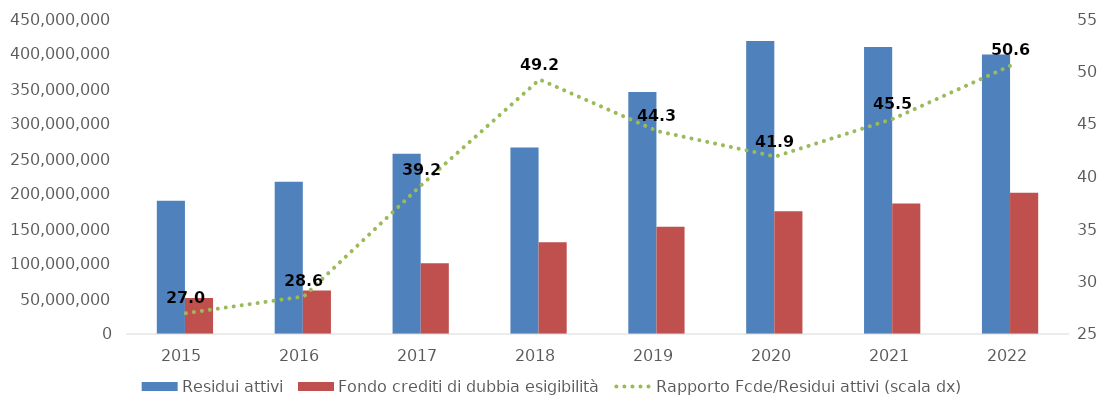
| Category | Residui attivi | Fondo crediti di dubbia esigibilità |
|---|---|---|
| 2015.0 | 190348755.29 | 51358060.25 |
| 2016.0 | 217400507.5 | 62122455.9 |
| 2017.0 | 257331335.33 | 100907175.2 |
| 2018.0 | 266437997.34 | 131186723.33 |
| 2019.0 | 345860981.12 | 153287529.56 |
| 2020.0 | 418596933.63 | 175387298.72 |
| 2021.0 | 409839833.45 | 186471352.11 |
| 2022.0 | 399246823.74 | 201941002.66 |